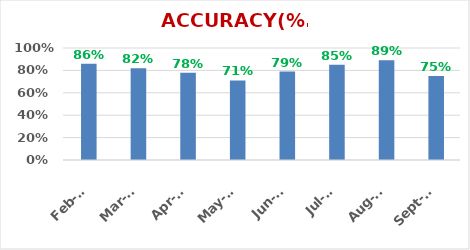
| Category | ACCURACY |
|---|---|
| 2019-09-01 | 0.75 |
| 2019-08-01 | 0.89 |
| 2019-07-01 | 0.85 |
| 2019-06-01 | 0.79 |
| 2019-05-01 | 0.71 |
| 2019-04-01 | 0.78 |
| 2019-03-01 | 0.82 |
| 2019-02-01 | 0.86 |